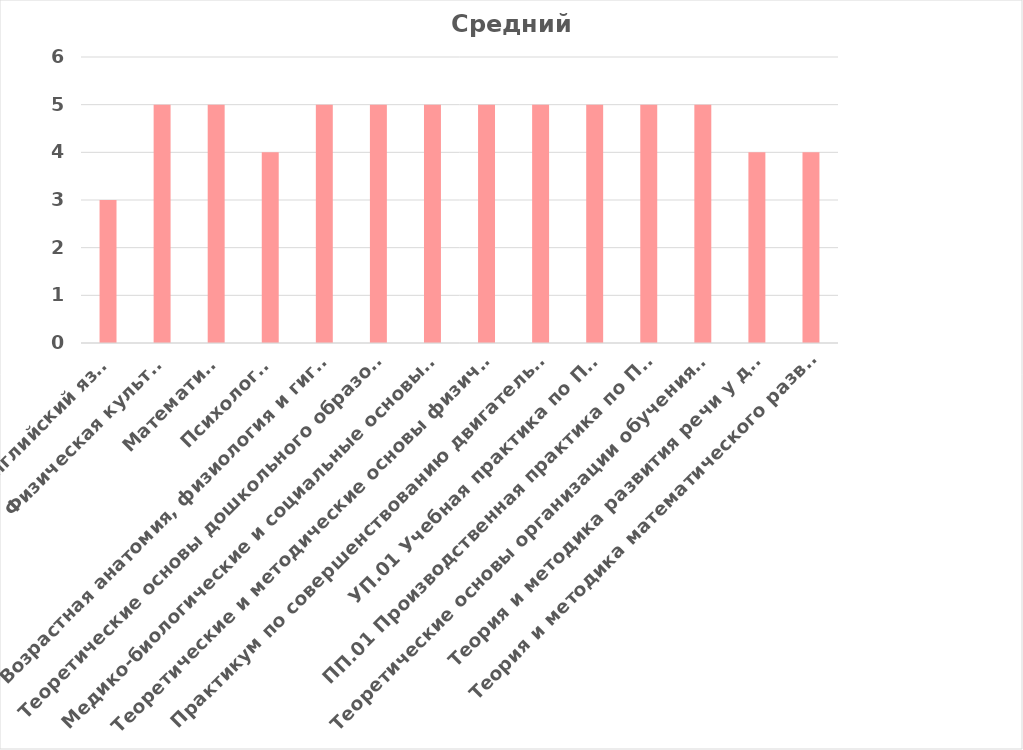
| Category | Средний балл |
|---|---|
| Английский язык | 3 |
| Физическая культура | 5 |
| Математика | 5 |
| Психология | 4 |
| Возрастная анатомия, физиология и гигиена | 5 |
| Теоретические основы дошкольного образования | 5 |
| Медико-биологические и социальные основы здоровья | 5 |
| Теоретические и методические основы физического воспитания и развития детей раннего и дошкольного возраста | 5 |
| Практикум по совершенствованию двигательных умений и навыков | 5 |
| УП.01 Учебная практика по ПМ.01 | 5 |
| ПП.01 Производственная практика по ПМ.01 | 5 |
| Теоретические основы организации обучения в разных возрастных группах | 5 |
| Теория и методика развития речи у детей | 4 |
| Теория и методика математического развития | 4 |